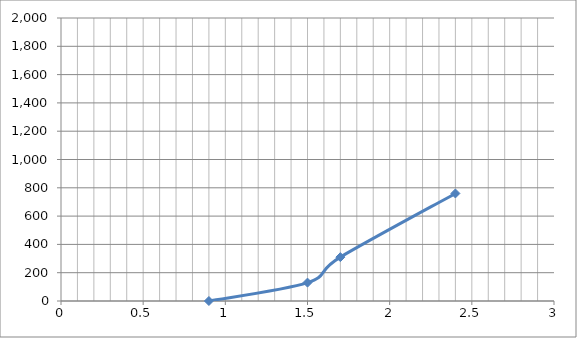
| Category | Series 0 |
|---|---|
| 0.9 | 0 |
| 1.5 | 130 |
| 1.7 | 310 |
| 2.4 | 760 |